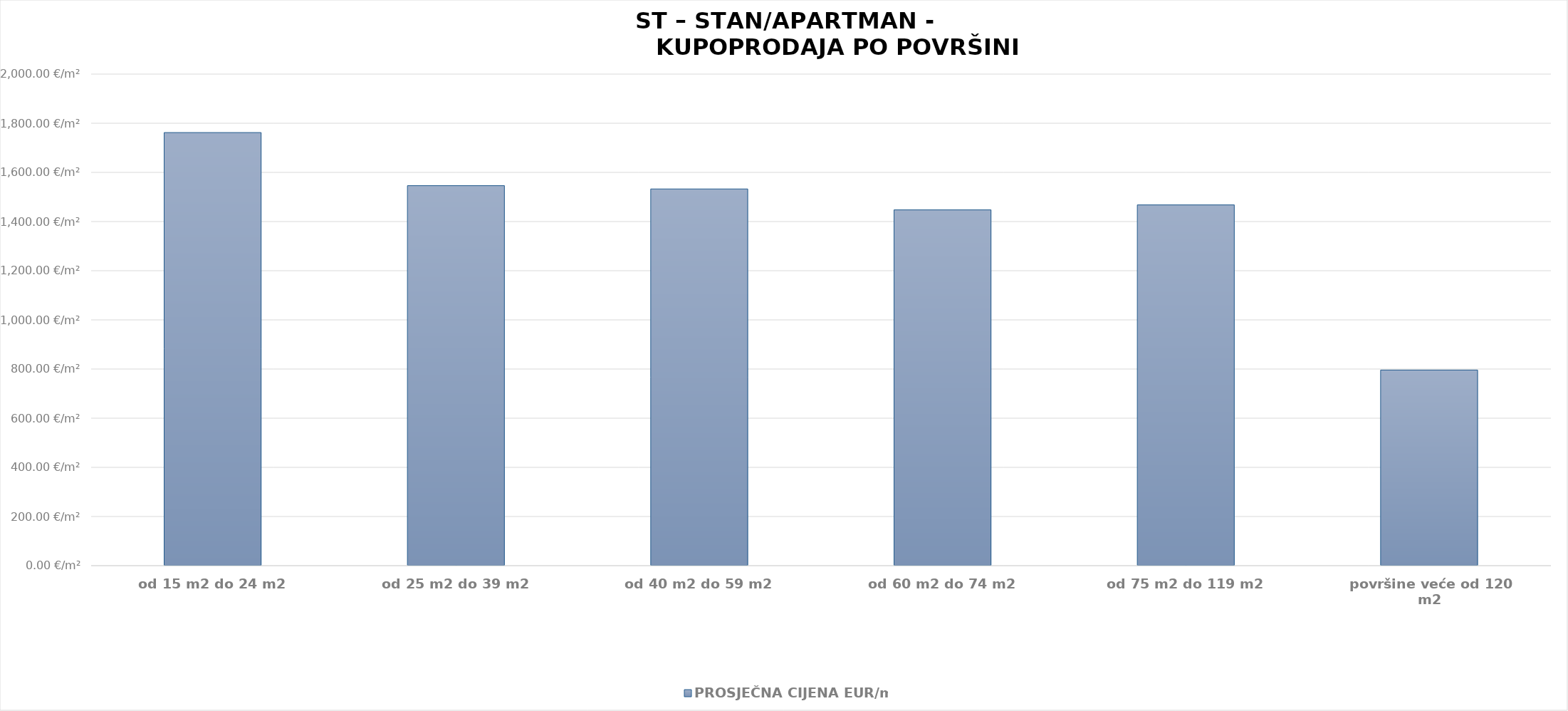
| Category | PROSJEČNA CIJENA EUR/m2 |
|---|---|
| od 15 m2 do 24 m2 | 1904-10-27 02:14:57 |
| od 25 m2 do 39 m2 | 1904-03-25 03:04:08 |
| od 40 m2 do 59 m2 | 1904-03-11 16:23:20 |
| od 60 m2 do 74 m2 | 1903-12-17 14:40:54 |
| od 75 m2 do 119 m2 | 1904-01-06 19:16:02 |
| površine veće od 120 m2 | 1902-03-05 21:07:46 |